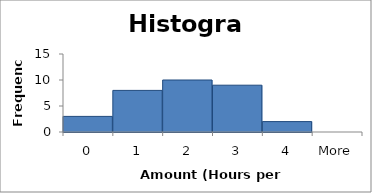
| Category | Frequency |
|---|---|
| 0 | 3 |
| 1 | 8 |
| 2 | 10 |
| 3 | 9 |
| 4 | 2 |
| More | 0 |